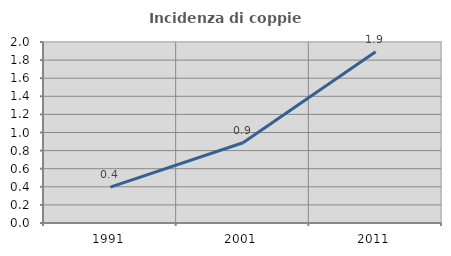
| Category | Incidenza di coppie miste |
|---|---|
| 1991.0 | 0.397 |
| 2001.0 | 0.886 |
| 2011.0 | 1.892 |